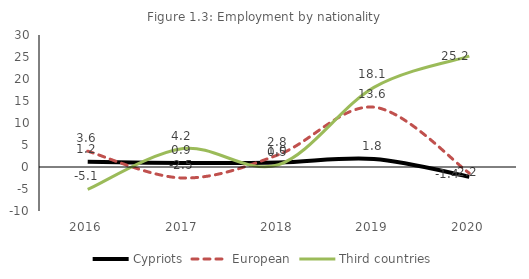
| Category | Cypriots | European | Third countries |
|---|---|---|---|
| 2016.0 | 1.2 | 3.6 | -5.1 |
| 2017.0 | 0.9 | -2.5 | 4.2 |
| 2018.0 | 1 | 2.8 | 0.5 |
| 2019.0 | 1.8 | 13.6 | 18.1 |
| 2020.0 | -2.2 | -1.4 | 25.2 |